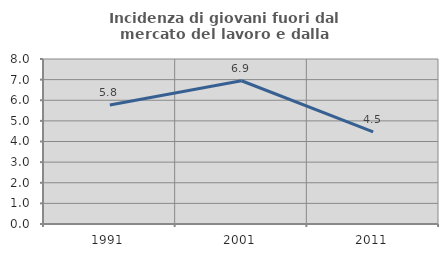
| Category | Incidenza di giovani fuori dal mercato del lavoro e dalla formazione  |
|---|---|
| 1991.0 | 5.767 |
| 2001.0 | 6.944 |
| 2011.0 | 4.465 |